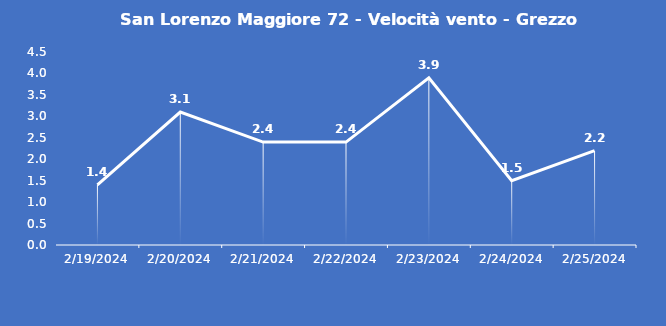
| Category | San Lorenzo Maggiore 72 - Velocità vento - Grezzo (m/s) |
|---|---|
| 2/19/24 | 1.4 |
| 2/20/24 | 3.1 |
| 2/21/24 | 2.4 |
| 2/22/24 | 2.4 |
| 2/23/24 | 3.9 |
| 2/24/24 | 1.5 |
| 2/25/24 | 2.2 |